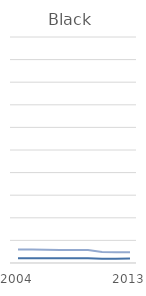
| Category | Black Staff | Black Student |
|---|---|---|
| 2004 | 2.1 | 6 |
|  | 2.1 | 6 |
|  | 2.1 | 5.9 |
|  | 2.1 | 5.8 |
|  | 2.1 | 5.8 |
|  | 2.1 | 5.7 |
|  | 1.9 | 4.9 |
|  | 1.9 | 4.8 |
| 2013 | 2 | 4.8 |